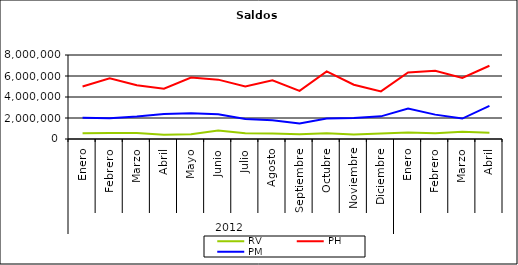
| Category | RV | PH | PM |
|---|---|---|---|
| 0 | 549778.168 | 5006132.96 | 2027838.04 |
| 1 | 570527.999 | 5771155.703 | 1979807.811 |
| 2 | 560604.832 | 5123876.98 | 2144060.858 |
| 3 | 406794.423 | 4795437.398 | 2380409.171 |
| 4 | 462649.26 | 5850616.083 | 2461213.349 |
| 5 | 809983.459 | 5653357.045 | 2353480.477 |
| 6 | 546190.07 | 4994057.097 | 1898309.443 |
| 7 | 522567.991 | 5588479.785 | 1784429.37 |
| 8 | 448289.909 | 4586134.432 | 1485313.653 |
| 9 | 545363.306 | 6443891.409 | 1946986.634 |
| 10 | 423789.041 | 5166977.96 | 1999930.741 |
| 11 | 520855.606 | 4534308.602 | 2157542.738 |
| 12 | 625726.624 | 6338490.057 | 2894951.851 |
| 13 | 552164.14 | 6505711.807 | 2320902.81 |
| 14 | 684317.675 | 5822855.149 | 1948127.804 |
| 15 | 601474.166 | 6976391.987 | 3151453.143 |